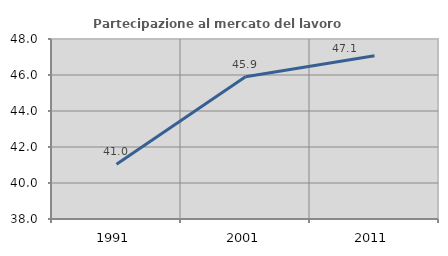
| Category | Partecipazione al mercato del lavoro  femminile |
|---|---|
| 1991.0 | 41.045 |
| 2001.0 | 45.905 |
| 2011.0 | 47.073 |